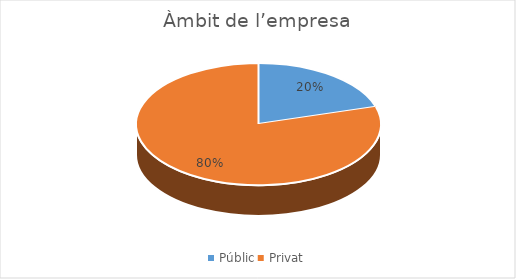
| Category | Series 0 |
|---|---|
| Públic | 40 |
| Privat | 156 |